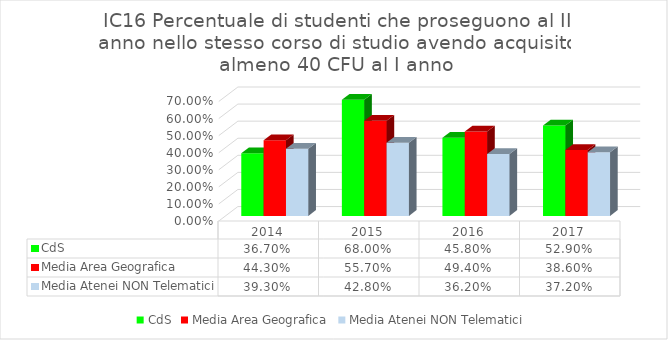
| Category | CdS | Media Area Geografica | Media Atenei NON Telematici |
|---|---|---|---|
| 2014.0 | 0.367 | 0.443 | 0.393 |
| 2015.0 | 0.68 | 0.557 | 0.428 |
| 2016.0 | 0.458 | 0.494 | 0.362 |
| 2017.0 | 0.529 | 0.386 | 0.372 |